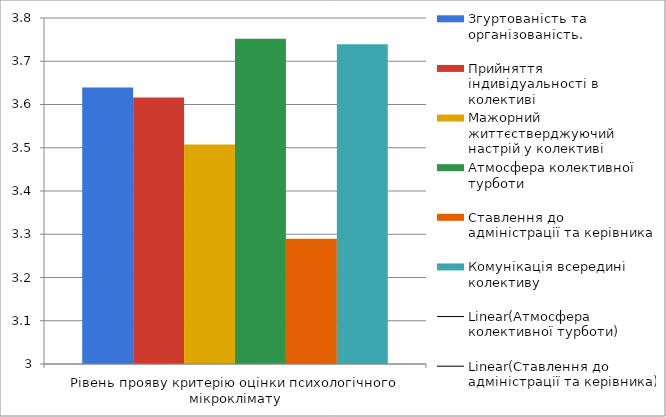
| Category | Згуртованість та організованість. | Прийняття індивідуальності в колективі | Мажорний життєстверджуючий настрій у колективі | Атмосфера колективної турботи | Ставлення до адміністрації та керівника | Комунікація всередині колективу | Найвище значення |
|---|---|---|---|---|---|---|---|
| 0 | 3.639 | 3.616 | 3.507 | 3.752 | 3.29 | 3.739 |  |